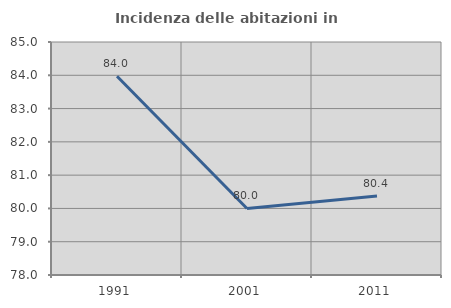
| Category | Incidenza delle abitazioni in proprietà  |
|---|---|
| 1991.0 | 83.969 |
| 2001.0 | 80 |
| 2011.0 | 80.374 |